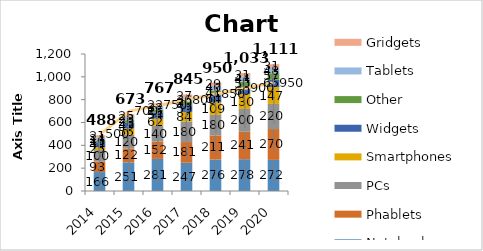
| Category | Notebooks | Phablets | PCs | Smartphones | Widgets | Other | Tablets | Gridgets |
|---|---|---|---|---|---|---|---|---|
| 2014.0 | 165.82 | 92.577 | 100 | 25.288 | 43.797 | 15.542 | 24.01 | 21.322 |
| 2015.0 | 250.649 | 122.175 | 120 | 54.764 | 48.88 | 23.445 | 28 | 25.102 |
| 2016.0 | 281.152 | 151.773 | 140 | 61.512 | 53.962 | 24.738 | 31.99 | 22.105 |
| 2017.0 | 247.405 | 181.371 | 180 | 83.857 | 59.045 | 30.372 | 35.979 | 27.441 |
| 2018.0 | 275.789 | 210.97 | 180 | 108.887 | 64.127 | 40.563 | 39.969 | 29.283 |
| 2019.0 | 278.416 | 240.568 | 200 | 129.598 | 59.62 | 49.842 | 43.958 | 31.179 |
| 2020.0 | 272.438 | 270.166 | 220 | 147.424 | 64.611 | 56.803 | 47.948 | 31.14 |